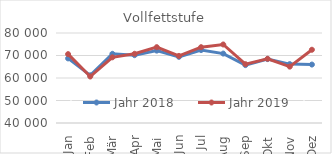
| Category | Jahr 2018 | Jahr 2019 |
|---|---|---|
| 0 | 68707.859 | 70608.665 |
| 1 | 61188.499 | 60659.535 |
| 2 | 70752.976 | 69191.743 |
| 3 | 70143.401 | 70758.994 |
| 4 | 72170.839 | 73703.906 |
| 5 | 69410.32 | 69817.418 |
| 6 | 72424.118 | 73692.126 |
| 7 | 70853.755 | 74895.273 |
| 8 | 65718.986 | 66147.65 |
| 9 | 68404.774 | 68556.515 |
| 10 | 66171.634 | 65055.248 |
| 11 | 65972.812 | 72559.197 |